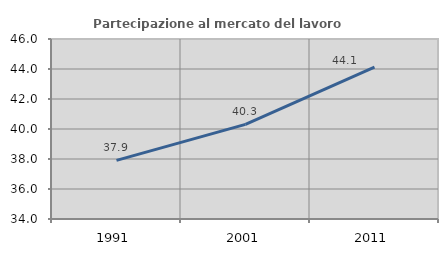
| Category | Partecipazione al mercato del lavoro  femminile |
|---|---|
| 1991.0 | 37.908 |
| 2001.0 | 40.307 |
| 2011.0 | 44.119 |